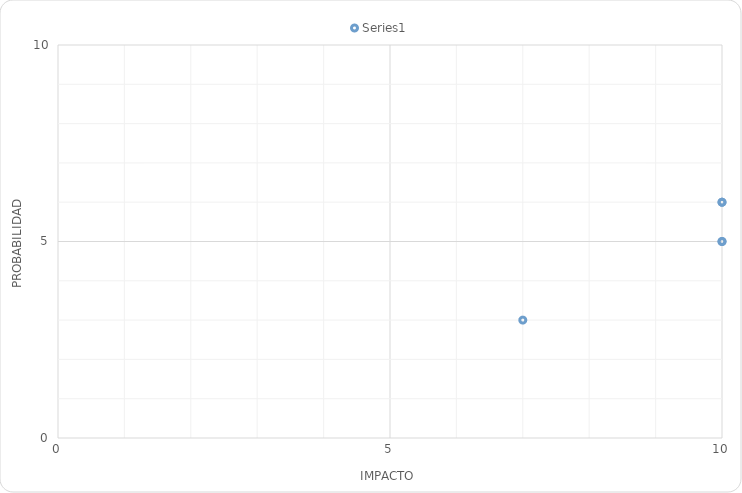
| Category | Series 0 |
|---|---|
| 10.0 | 6 |
| 10.0 | 5 |
| 10.0 | 6 |
| 10.0 | 5 |
| 7.0 | 3 |